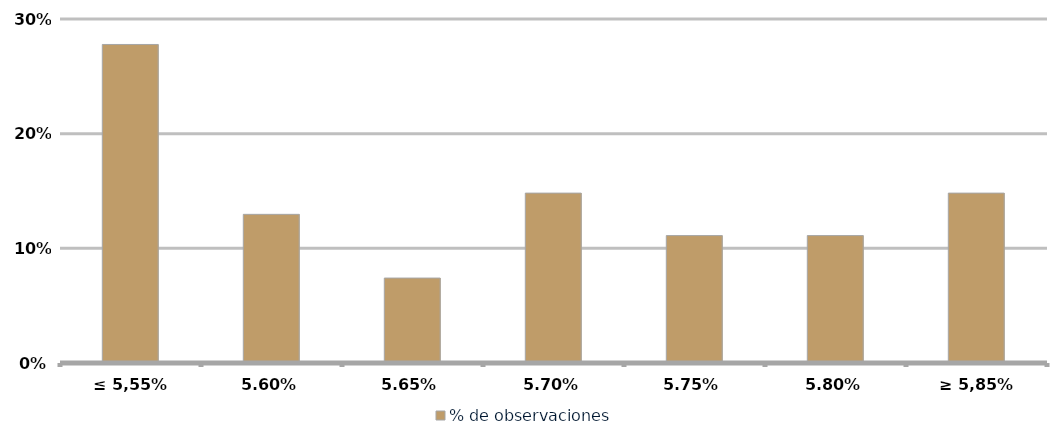
| Category | % de observaciones  |
|---|---|
| ≤ 5,55% | 0.278 |
| 5,60% | 0.13 |
| 5,65% | 0.074 |
| 5,70% | 0.148 |
| 5,75% | 0.111 |
| 5,80% | 0.111 |
| ≥ 5,85% | 0.148 |